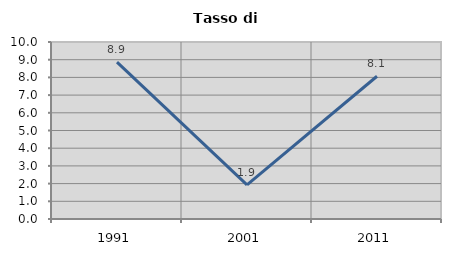
| Category | Tasso di disoccupazione   |
|---|---|
| 1991.0 | 8.861 |
| 2001.0 | 1.923 |
| 2011.0 | 8.065 |